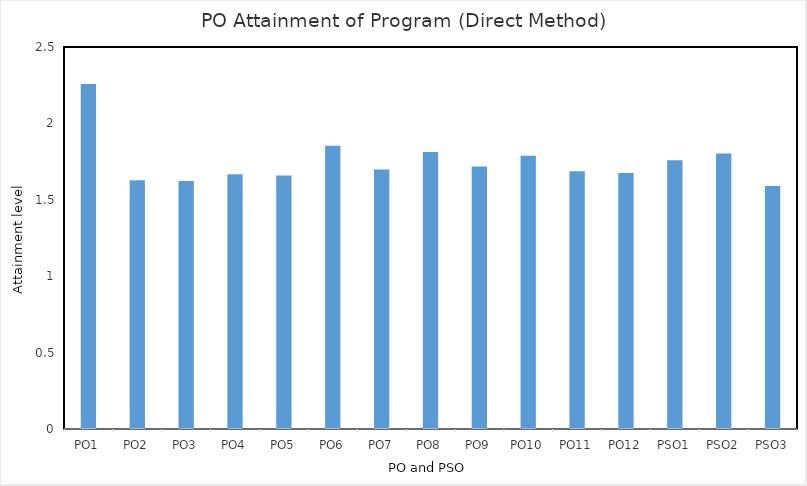
| Category | PO1 |
|---|---|
| PO1 | 2.259 |
| PO2 | 1.627 |
| PO3 | 1.622 |
| PO4 | 1.667 |
| PO5 | 1.659 |
| PO6 | 1.854 |
| PO7 | 1.698 |
| PO8 | 1.813 |
| PO9 | 1.718 |
| PO10 | 1.789 |
| PO11 | 1.686 |
| PO12 | 1.675 |
| PSO1 | 1.758 |
| PSO2 | 1.803 |
| PSO3 | 1.591 |